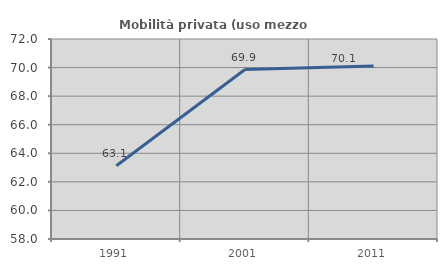
| Category | Mobilità privata (uso mezzo privato) |
|---|---|
| 1991.0 | 63.13 |
| 2001.0 | 69.864 |
| 2011.0 | 70.113 |